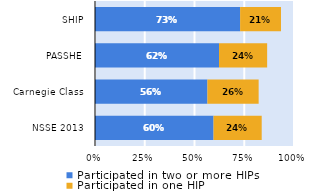
| Category | Participated in two or more HIPs | Participated in one HIP |
|---|---|---|
| NSSE 2013 | 0.596 | 0.242 |
| Carnegie Class | 0.565 | 0.257 |
| PASSHE | 0.623 | 0.242 |
| SHIP | 0.729 | 0.205 |